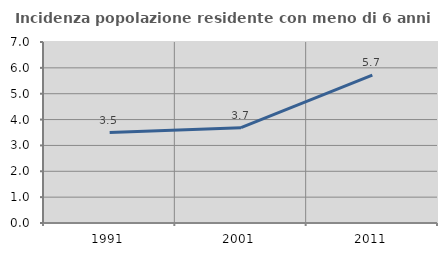
| Category | Incidenza popolazione residente con meno di 6 anni |
|---|---|
| 1991.0 | 3.497 |
| 2001.0 | 3.687 |
| 2011.0 | 5.72 |